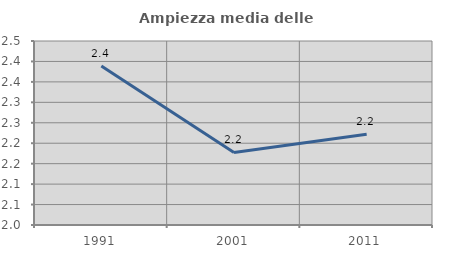
| Category | Ampiezza media delle famiglie |
|---|---|
| 1991.0 | 2.389 |
| 2001.0 | 2.177 |
| 2011.0 | 2.222 |